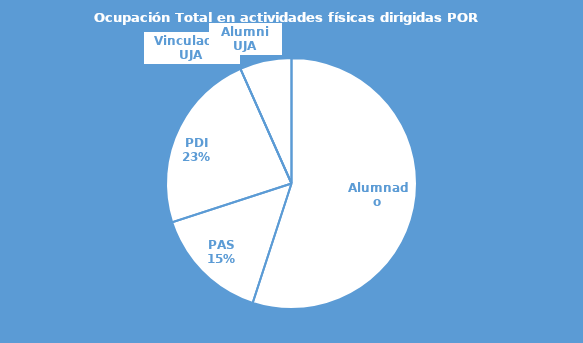
| Category | Series 0 |
|---|---|
| Alumnado | 0.55 |
| PAS | 0.15 |
| PDI | 0.233 |
| Vinculados UJA | 0 |
| Alumni UJA | 0.067 |